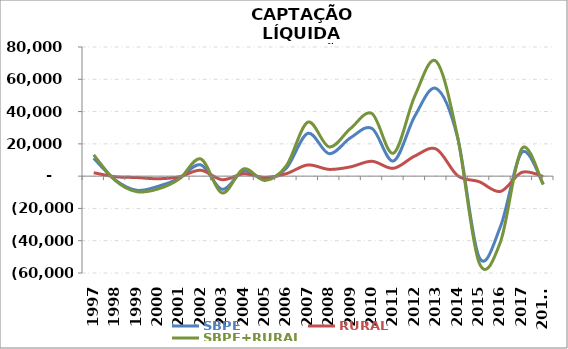
| Category | SBPE | RURAL | SBPE+RURAL |
|---|---|---|---|
| 1997 | 11079 | 2113.852 | 13192.852 |
| 1998 | -2301.5 | -361.228 | -2662.728 |
| 1999 | -8740.2 | -858.508 | -9598.708 |
| 2000 | -6355.964 | -1615.457 | -7971.421 |
| 2001 | -1319.381 | -412.963 | -1732.344 |
| 2002 | 7008.282 | 3649.972 | 10658.254 |
| 2003 | -8178.886 | -2213.868 | -10392.754 |
| 2004 | 3057.299 | 1425.147 | 4482.446 |
| 2005 | -1869.531 | -826.948 | -2696.479 |
| 2006 | 4963.736 | 1532.919 | 6496.655 |
| 2007 | 26493.6 | 6927.358 | 33420.958 |
| 2008 | 13900.71 | 4187.043 | 18087.753 |
| 2009 | 23813.033 | 5752.651 | 29565.684 |
| 2010 | 29513.472 | 9213.301 | 38726.773 |
| 2011 | 9382.932 | 4844.657 | 14227.589 |
| 2012 | 37239.575 | 12479.984 | 49719.559 |
| 2013 | 54280.749 | 16766.843 | 71047.592 |
| 2014 | 23758.558 | 275.423 | 24033.981 |
| 2015 | -50149.363 | -3418.504 | -53567.867 |
| 2016 | -31222.546 | -9479.207 | -40701.753 |
| 2017 | 14774.799 | 2351.903 | 17126.702 |
| 2018* | -4974.781 | -226.378 | -5201.159 |